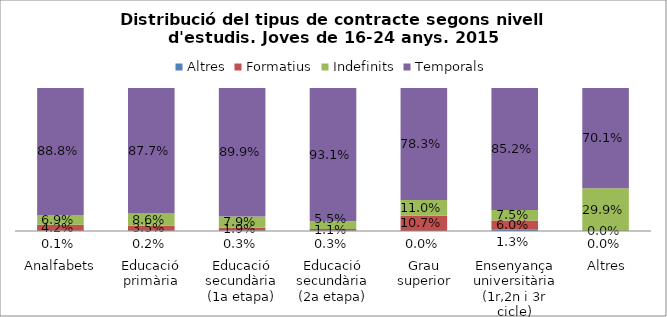
| Category | Altres | Formatius | Indefinits | Temporals |
|---|---|---|---|---|
|  
Analfabets | 0.001 | 0.042 | 0.069 | 0.888 |
| 
Educació primària | 0.002 | 0.035 | 0.086 | 0.877 |
| 
Educació secundària (1a etapa) | 0.003 | 0.019 | 0.079 | 0.899 |
| 
Educació secundària (2a etapa) | 0.003 | 0.011 | 0.055 | 0.931 |
| 
Grau superior | 0 | 0.107 | 0.11 | 0.783 |
| 
Ensenyança universitària (1r,2n i 3r cicle) | 0.013 | 0.06 | 0.075 | 0.852 |
| 
Altres | 0 | 0 | 0.299 | 0.701 |